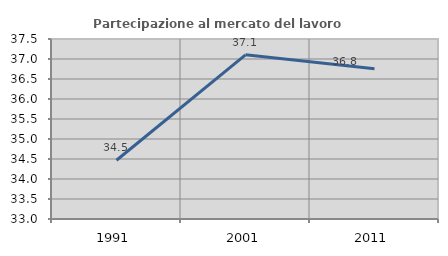
| Category | Partecipazione al mercato del lavoro  femminile |
|---|---|
| 1991.0 | 34.468 |
| 2001.0 | 37.104 |
| 2011.0 | 36.758 |